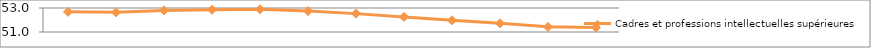
| Category | Cadres et professions intellectuelles supérieures |
|---|---|
| 2007.0 | 52.68 |
| 2008.0 | 52.643 |
| 2009.0 | 52.8 |
| 2010.0 | 52.854 |
| 2011.0 | 52.892 |
| 2012.0 | 52.741 |
| 2013.0 | 52.531 |
| 2014.0 | 52.257 |
| 2015.0 | 51.976 |
| 2016.0 | 51.726 |
| 2017.0 | 51.428 |
| 2018.0 | 51.379 |